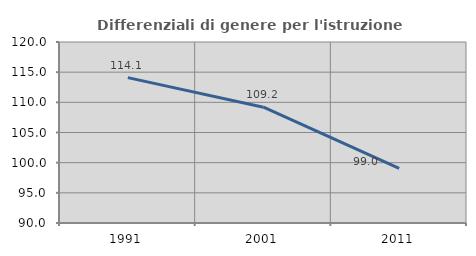
| Category | Differenziali di genere per l'istruzione superiore |
|---|---|
| 1991.0 | 114.098 |
| 2001.0 | 109.194 |
| 2011.0 | 99.045 |